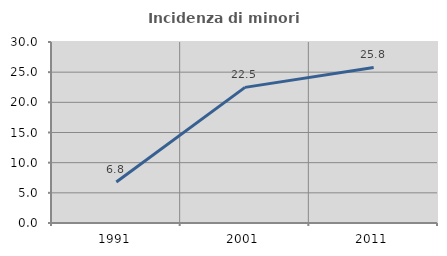
| Category | Incidenza di minori stranieri |
|---|---|
| 1991.0 | 6.799 |
| 2001.0 | 22.477 |
| 2011.0 | 25.778 |